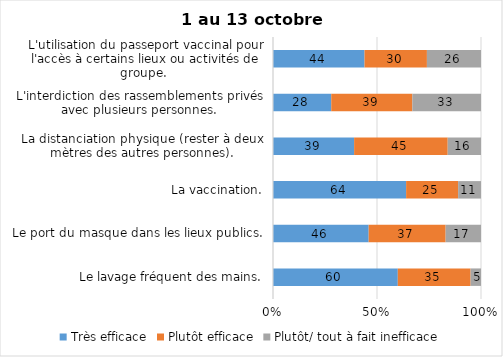
| Category | Très efficace | Plutôt efficace | Plutôt/ tout à fait inefficace |
|---|---|---|---|
| Le lavage fréquent des mains. | 60 | 35 | 5 |
| Le port du masque dans les lieux publics. | 46 | 37 | 17 |
| La vaccination. | 64 | 25 | 11 |
| La distanciation physique (rester à deux mètres des autres personnes). | 39 | 45 | 16 |
| L'interdiction des rassemblements privés avec plusieurs personnes. | 28 | 39 | 33 |
| L'utilisation du passeport vaccinal pour l'accès à certains lieux ou activités de groupe.  | 44 | 30 | 26 |